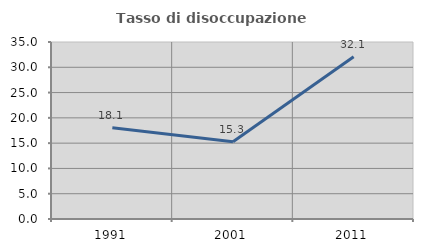
| Category | Tasso di disoccupazione giovanile  |
|---|---|
| 1991.0 | 18.053 |
| 2001.0 | 15.278 |
| 2011.0 | 32.082 |